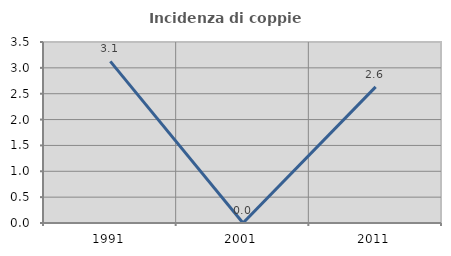
| Category | Incidenza di coppie miste |
|---|---|
| 1991.0 | 3.125 |
| 2001.0 | 0 |
| 2011.0 | 2.632 |